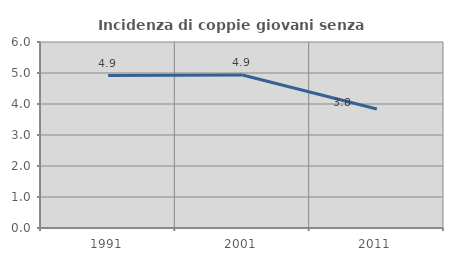
| Category | Incidenza di coppie giovani senza figli |
|---|---|
| 1991.0 | 4.918 |
| 2001.0 | 4.935 |
| 2011.0 | 3.837 |